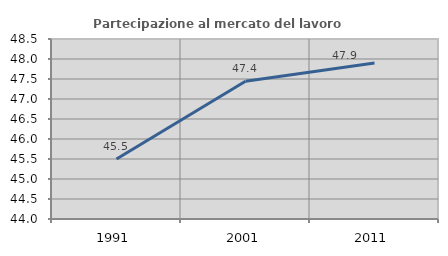
| Category | Partecipazione al mercato del lavoro  femminile |
|---|---|
| 1991.0 | 45.498 |
| 2001.0 | 47.445 |
| 2011.0 | 47.901 |